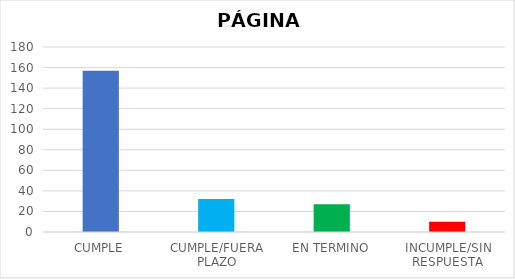
| Category | TOTAL |
|---|---|
| CUMPLE | 157 |
| CUMPLE/FUERA PLAZO | 32 |
| EN TERMINO | 27 |
| INCUMPLE/SIN RESPUESTA | 10 |